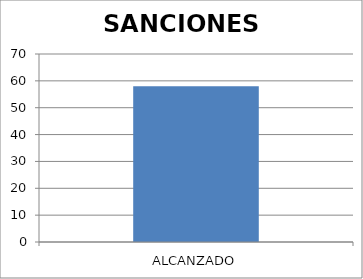
| Category | SANCIONES IMPUESTAS |
|---|---|
| ALCANZADO | 58 |